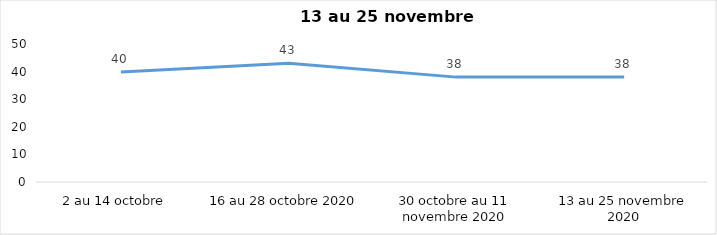
| Category | Series 0 |
|---|---|
| 2 au 14 octobre  | 39.85 |
| 16 au 28 octobre 2020 | 43 |
| 30 octobre au 11 novembre 2020 | 38 |
| 13 au 25 novembre 2020 | 38 |